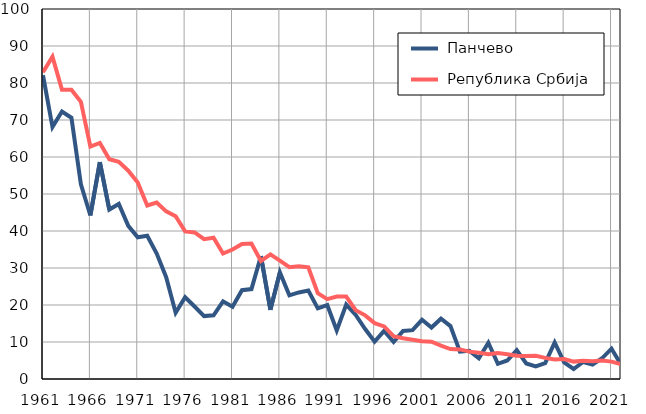
| Category |  Панчево |  Република Србија |
|---|---|---|
| 1961.0 | 82.1 | 82.9 |
| 1962.0 | 68.1 | 87.1 |
| 1963.0 | 72.3 | 78.2 |
| 1964.0 | 70.6 | 78.2 |
| 1965.0 | 52.6 | 74.9 |
| 1966.0 | 44.2 | 62.8 |
| 1967.0 | 58.6 | 63.8 |
| 1968.0 | 45.8 | 59.4 |
| 1969.0 | 47.3 | 58.7 |
| 1970.0 | 41.4 | 56.3 |
| 1971.0 | 38.3 | 53.1 |
| 1972.0 | 38.7 | 46.9 |
| 1973.0 | 33.9 | 47.7 |
| 1974.0 | 27.5 | 45.3 |
| 1975.0 | 17.9 | 44 |
| 1976.0 | 22.1 | 39.9 |
| 1977.0 | 19.6 | 39.6 |
| 1978.0 | 17 | 37.8 |
| 1979.0 | 17.2 | 38.2 |
| 1980.0 | 21 | 33.9 |
| 1981.0 | 19.5 | 35 |
| 1982.0 | 24 | 36.5 |
| 1983.0 | 24.3 | 36.6 |
| 1984.0 | 33.2 | 31.9 |
| 1985.0 | 18.7 | 33.7 |
| 1986.0 | 28.8 | 32 |
| 1987.0 | 22.6 | 30.2 |
| 1988.0 | 23.4 | 30.5 |
| 1989.0 | 23.9 | 30.2 |
| 1990.0 | 19.1 | 23.2 |
| 1991.0 | 20 | 21.6 |
| 1992.0 | 13.1 | 22.3 |
| 1993.0 | 20.1 | 22.3 |
| 1994.0 | 17.3 | 18.6 |
| 1995.0 | 13.5 | 17.2 |
| 1996.0 | 10.1 | 15.1 |
| 1997.0 | 13 | 14.2 |
| 1998.0 | 10 | 11.6 |
| 1999.0 | 13 | 11 |
| 2000.0 | 13.2 | 10.6 |
| 2001.0 | 16 | 10.2 |
| 2002.0 | 13.9 | 10.1 |
| 2003.0 | 16.3 | 9 |
| 2004.0 | 14.3 | 8.1 |
| 2005.0 | 7.4 | 8 |
| 2006.0 | 7.6 | 7.4 |
| 2007.0 | 5.6 | 7.1 |
| 2008.0 | 9.8 | 6.7 |
| 2009.0 | 4.1 | 7 |
| 2010.0 | 5 | 6.7 |
| 2011.0 | 7.8 | 6.3 |
| 2012.0 | 4.2 | 6.2 |
| 2013.0 | 3.4 | 6.3 |
| 2014.0 | 4.3 | 5.7 |
| 2015.0 | 9.9 | 5.3 |
| 2016.0 | 4.5 | 5.4 |
| 2017.0 | 2.7 | 4.7 |
| 2018.0 | 4.6 | 4.9 |
| 2019.0 | 3.9 | 4.8 |
| 2020.0 | 5.6 | 5 |
| 2021.0 | 8.2 | 4.7 |
| 2022.0 | 3.9 | 4 |